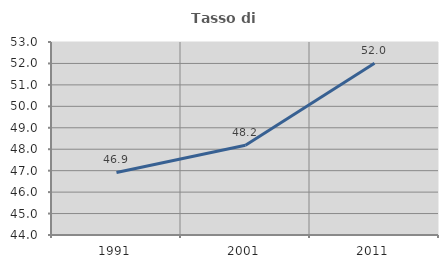
| Category | Tasso di occupazione   |
|---|---|
| 1991.0 | 46.916 |
| 2001.0 | 48.183 |
| 2011.0 | 52.014 |